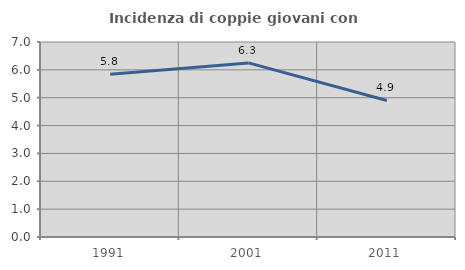
| Category | Incidenza di coppie giovani con figli |
|---|---|
| 1991.0 | 5.839 |
| 2001.0 | 6.25 |
| 2011.0 | 4.902 |